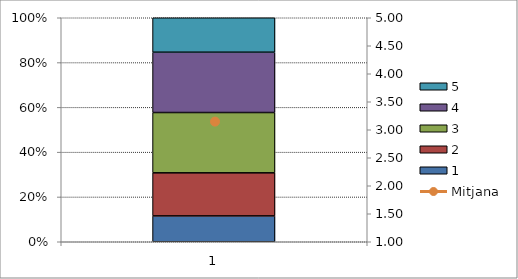
| Category | 1 | 2 | 3 | 4 | 5 |
|---|---|---|---|---|---|
| 0 | 3 | 5 | 7 | 7 | 4 |